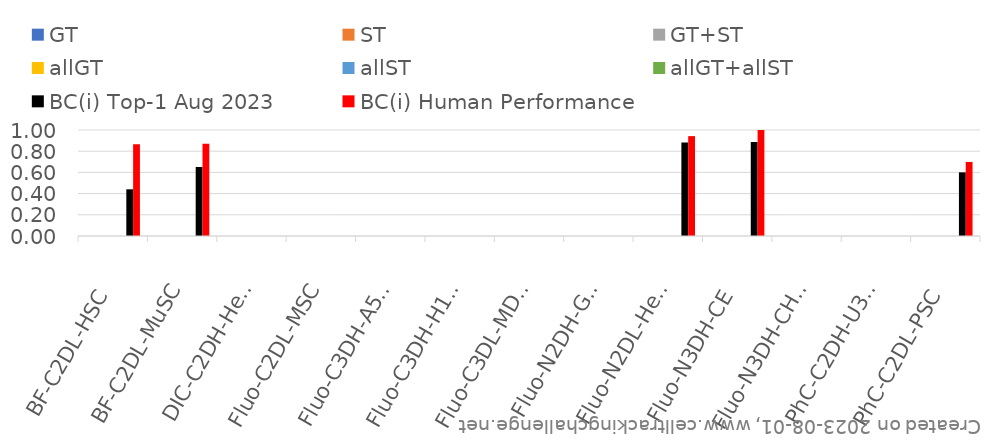
| Category | GT | ST | GT+ST | allGT | allST | allGT+allST | BC(i) Top-1 Aug 2023 | BC(i) Human Performance |
|---|---|---|---|---|---|---|---|---|
| BF-C2DL-HSC | 0 | 0 | 0 | 0 | 0 | 0 | 0.44 | 0.866 |
| BF-C2DL-MuSC | 0 | 0 | 0 | 0 | 0 | 0 | 0.651 | 0.87 |
| DIC-C2DH-HeLa | 0 | 0 | 0 | 0 | 0 | 0 | 0 | 0 |
| Fluo-C2DL-MSC | 0 | 0 | 0 | 0 | 0 | 0 | 0 | 0 |
| Fluo-C3DH-A549 | 0 | 0 | 0 | 0 | 0 | 0 | 0 | 0 |
| Fluo-C3DH-H157 | 0 | 0 | 0 | 0 | 0 | 0 | 0 | 0 |
| Fluo-C3DL-MDA231 | 0 | 0 | 0 | 0 | 0 | 0 | 0 | 0 |
| Fluo-N2DH-GOWT1 | 0 | 0 | 0 | 0 | 0 | 0 | 0 | 0 |
| Fluo-N2DL-HeLa | 0 | 0 | 0 | 0 | 0 | 0 | 0.882 | 0.942 |
| Fluo-N3DH-CE | 0 | 0 | 0 | 0 | 0 | 0 | 0.887 | 1 |
| Fluo-N3DH-CHO | 0 | 0 | 0 | 0 | 0 | 0 | 0 | 0 |
| PhC-C2DH-U373 | 0 | 0 | 0 | 0 | 0 | 0 | 0 | 0 |
| PhC-C2DL-PSC | 0 | 0 | 0 | 0 | 0 | 0 | 0.6 | 0.699 |